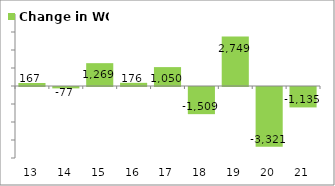
| Category | Change in WC |
|---|---|
| 2013-03-31 | 167.4 |
| 2014-03-31 | -76.86 |
| 2015-03-31 | 1268.74 |
| 2016-03-31 | 176.05 |
| 2017-03-31 | 1049.83 |
| 2018-03-31 | -1508.65 |
| 2019-03-31 | 2749.07 |
| 2020-03-31 | -3320.53 |
| 2021-03-31 | -1134.74 |